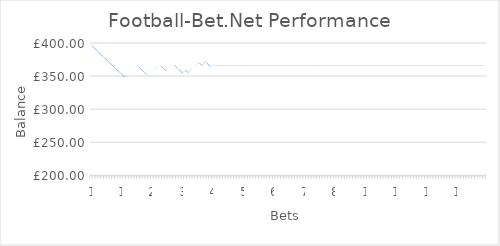
| Category | Bank @ Odds Taken |
|---|---|
| 0 | 396 |
| 1 | 392 |
| 2 | 388 |
| 3 | 384 |
| 4 | 380 |
| 5 | 376 |
| 6 | 372 |
| 7 | 368 |
| 8 | 364 |
| 9 | 360 |
| 10 | 356 |
| 11 | 352 |
| 12 | 348 |
| 13 | 352.788 |
| 14 | 355.258 |
| 15 | 358.488 |
| 16 | 361.148 |
| 17 | 363.808 |
| 18 | 359.808 |
| 19 | 355.808 |
| 20 | 351.808 |
| 21 | 354.848 |
| 22 | 358.268 |
| 23 | 360.89 |
| 24 | 362.41 |
| 25 | 365.298 |
| 26 | 361.298 |
| 27 | 357.298 |
| 28 | 359.958 |
| 29 | 363.036 |
| 30 | 365.886 |
| 31 | 361.886 |
| 32 | 357.886 |
| 33 | 353.886 |
| 34 | 358.598 |
| 35 | 354.598 |
| 36 | 360.108 |
| 37 | 363.414 |
| 38 | 367.214 |
| 39 | 369.418 |
| 40 | 365.418 |
| 41 | 371.802 |
| 42 | 367.802 |
| 43 | 363.802 |
| 44 | 366.196 |
| 45 | 366.196 |
| 46 | 366.196 |
| 47 | 366.196 |
| 48 | 366.196 |
| 49 | 366.196 |
| 50 | 366.196 |
| 51 | 366.196 |
| 52 | 366.196 |
| 53 | 366.196 |
| 54 | 366.196 |
| 55 | 366.196 |
| 56 | 366.196 |
| 57 | 366.196 |
| 58 | 366.196 |
| 59 | 366.196 |
| 60 | 366.196 |
| 61 | 366.196 |
| 62 | 366.196 |
| 63 | 366.196 |
| 64 | 366.196 |
| 65 | 366.196 |
| 66 | 366.196 |
| 67 | 366.196 |
| 68 | 366.196 |
| 69 | 366.196 |
| 70 | 366.196 |
| 71 | 366.196 |
| 72 | 366.196 |
| 73 | 366.196 |
| 74 | 366.196 |
| 75 | 366.196 |
| 76 | 366.196 |
| 77 | 366.196 |
| 78 | 366.196 |
| 79 | 366.196 |
| 80 | 366.196 |
| 81 | 366.196 |
| 82 | 366.196 |
| 83 | 366.196 |
| 84 | 366.196 |
| 85 | 366.196 |
| 86 | 366.196 |
| 87 | 366.196 |
| 88 | 366.196 |
| 89 | 366.196 |
| 90 | 366.196 |
| 91 | 366.196 |
| 92 | 366.196 |
| 93 | 366.196 |
| 94 | 366.196 |
| 95 | 366.196 |
| 96 | 366.196 |
| 97 | 366.196 |
| 98 | 366.196 |
| 99 | 366.196 |
| 100 | 366.196 |
| 101 | 366.196 |
| 102 | 366.196 |
| 103 | 366.196 |
| 104 | 366.196 |
| 105 | 366.196 |
| 106 | 366.196 |
| 107 | 366.196 |
| 108 | 366.196 |
| 109 | 366.196 |
| 110 | 366.196 |
| 111 | 366.196 |
| 112 | 366.196 |
| 113 | 366.196 |
| 114 | 366.196 |
| 115 | 366.196 |
| 116 | 366.196 |
| 117 | 366.196 |
| 118 | 366.196 |
| 119 | 366.196 |
| 120 | 366.196 |
| 121 | 366.196 |
| 122 | 366.196 |
| 123 | 366.196 |
| 124 | 366.196 |
| 125 | 366.196 |
| 126 | 366.196 |
| 127 | 366.196 |
| 128 | 366.196 |
| 129 | 366.196 |
| 130 | 366.196 |
| 131 | 366.196 |
| 132 | 366.196 |
| 133 | 366.196 |
| 134 | 366.196 |
| 135 | 366.196 |
| 136 | 366.196 |
| 137 | 366.196 |
| 138 | 366.196 |
| 139 | 366.196 |
| 140 | 366.196 |
| 141 | 366.196 |
| 142 | 366.196 |